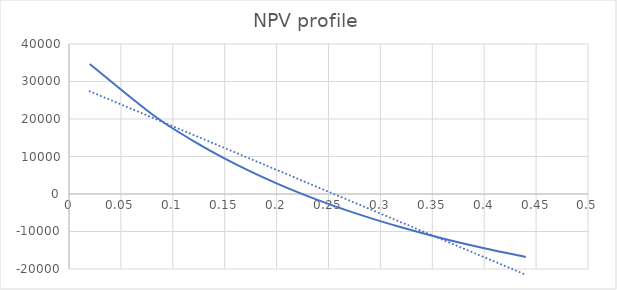
| Category | Series 0 |
|---|---|
| 0.02 | 34657.466 |
| 0.08 | 21278.987 |
| 0.12 | 14118.33 |
| 0.16 | 8043.557 |
| 0.2 | 2849.794 |
| 0.24 | -1622.926 |
| 0.28 | -5500.706 |
| 0.32 | -8883.841 |
| 0.36 | -11852.776 |
| 0.4 | -14472.541 |
| 0.44 | -16796.097 |